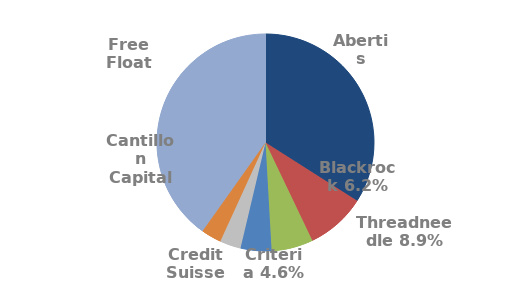
| Category | Series 0 |
|---|---|
| Abertis | 0.34 |
| Threadneedle | 0.089 |
| Blackrock | 0.062 |
| Criteria | 0.046 |
| Credit Suisse | 0.031 |
| Cantillon Capital | 0.03 |
| Free Float | 0.401 |